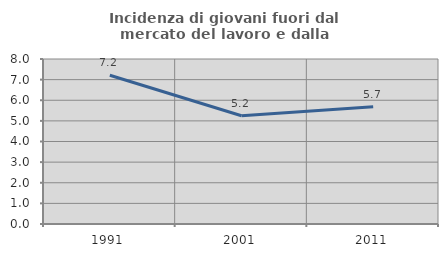
| Category | Incidenza di giovani fuori dal mercato del lavoro e dalla formazione  |
|---|---|
| 1991.0 | 7.211 |
| 2001.0 | 5.247 |
| 2011.0 | 5.69 |